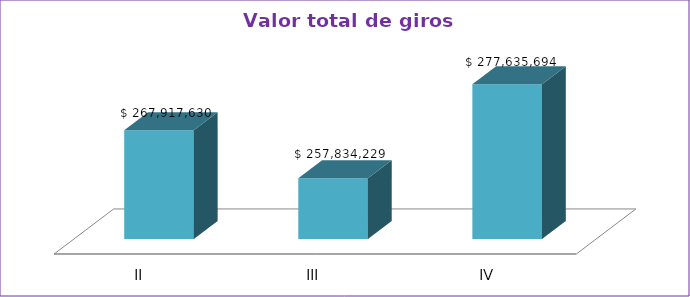
| Category | Series 0 |
|---|---|
| II | 267917630 |
| III | 257834229 |
| IV | 277635694 |